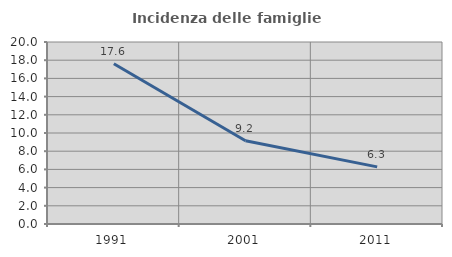
| Category | Incidenza delle famiglie numerose |
|---|---|
| 1991.0 | 17.614 |
| 2001.0 | 9.152 |
| 2011.0 | 6.276 |